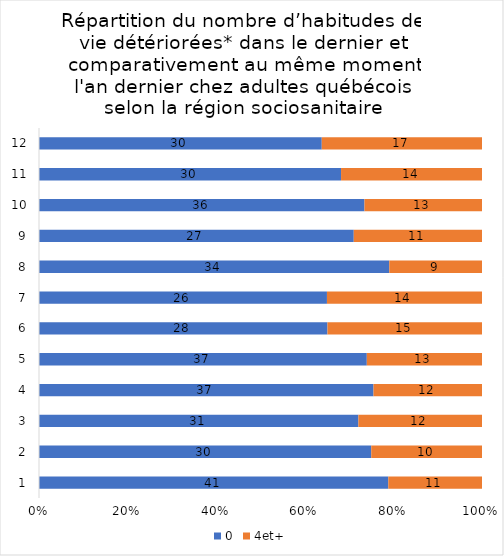
| Category | 0 | 4et+ |
|---|---|---|
| 0 | 41 | 11 |
| 1 | 30 | 10 |
| 2 | 31 | 12 |
| 3 | 37 | 12 |
| 4 | 37 | 13 |
| 5 | 28 | 15 |
| 6 | 26 | 14 |
| 7 | 34 | 9 |
| 8 | 27 | 11 |
| 9 | 36 | 13 |
| 10 | 30 | 14 |
| 11 | 30 | 17 |